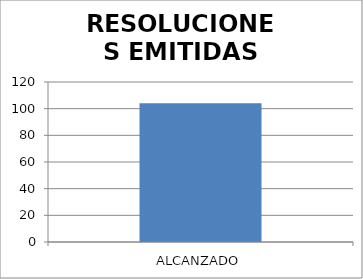
| Category | RESOLUCIONES EMITIDAS DSR |
|---|---|
| ALCANZADO | 104 |